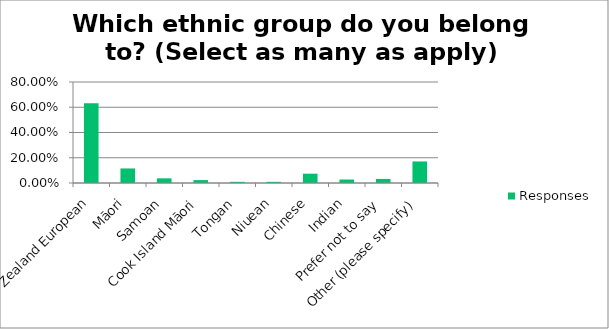
| Category | Responses |
|---|---|
| New Zealand European | 0.631 |
| Māori | 0.115 |
| Samoan | 0.037 |
| Cook Island Māori | 0.023 |
| Tongan | 0.009 |
| Niuean | 0.009 |
| Chinese | 0.074 |
| Indian | 0.028 |
| Prefer not to say | 0.032 |
| Other (please specify) | 0.17 |